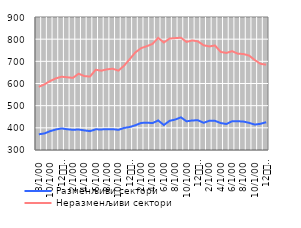
| Category | Разменљиви сектори | Неразменљиви сектори |
|---|---|---|
| 8 | 370.787 | 584.998 |
| 9 | 374.739 | 596.277 |
| 10 | 385.197 | 611.206 |
| 11 | 392.558 | 623.142 |
| 12
2010. | 397.501 | 630.594 |
| 1 | 393.502 | 628.062 |
| 2 | 391.269 | 625.432 |
| 3 | 392.509 | 644.125 |
| 4 | 388.496 | 633.407 |
| 5 | 385.078 | 631.299 |
| 6 | 393.07 | 662.02 |
| 7 | 392.987 | 657.725 |
| 8 | 393.266 | 663.948 |
| 9 | 394.02 | 666.654 |
| 10 | 390.948 | 657.982 |
| 11 | 399.518 | 680.249 |
| 12
2011. | 403.696 | 710.142 |
| 1 | 411.767 | 740.676 |
| 2 | 422.01 | 759.507 |
| 3 | 423.346 | 768.382 |
| 4 | 421.356 | 778.581 |
| 5 | 433.306 | 805.628 |
| 6 | 412.629 | 784.958 |
| 7 | 431.524 | 802.815 |
| 8 | 437.346 | 804.779 |
| 9 | 447.329 | 806.594 |
| 10 | 429.189 | 787.539 |
| 11 | 433.397 | 794.418 |
| 12
2012. | 434.042 | 789.826 |
| 1 | 422.677 | 772.446 |
| 2 | 431.864 | 767.323 |
| 3 | 431.48 | 771.449 |
| 4 | 421.538 | 742.671 |
| 5 | 417.27 | 737.834 |
| 6 | 429.508 | 745.87 |
| 7 | 429.796 | 734.697 |
| 8 | 428.32 | 733.006 |
| 9 | 422.412 | 725.945 |
| 10 | 414.621 | 705.753 |
| 11 | 418.196 | 688.975 |
| 12
2013. | 425.341 | 684.896 |